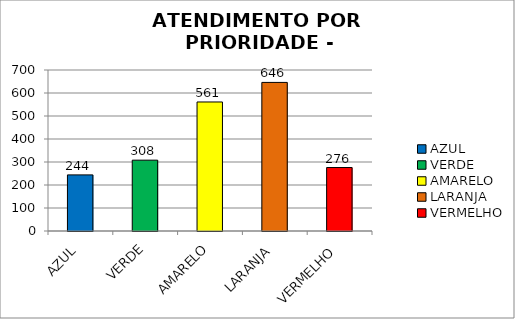
| Category | Total Regional: |
|---|---|
| AZUL | 244 |
| VERDE | 308 |
| AMARELO | 561 |
| LARANJA | 646 |
| VERMELHO | 276 |